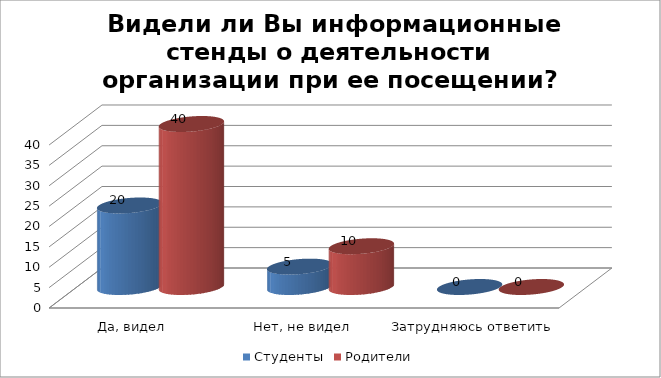
| Category | Студенты | Родители |
|---|---|---|
| Да, видел | 20 | 40 |
| Нет, не видел | 5 | 10 |
| Затрудняюсь ответить | 0 | 0 |